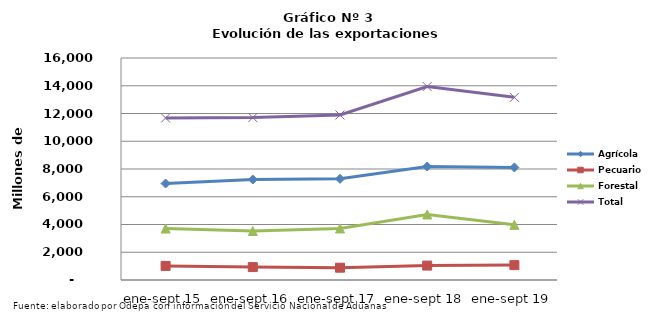
| Category | Agrícola | Pecuario | Forestal | Total |
|---|---|---|---|---|
| ene-sept 15 | 6952954 | 1013702 | 3706848 | 11673504 |
| ene-sept 16 | 7242655 | 930928 | 3530666 | 11704249 |
| ene-sept 17 | 7291030 | 887030 | 3715359 | 11893419 |
| ene-sept 18 | 8179024 | 1039924 | 4724575 | 13943523 |
| ene-sept 19 | 8113921 | 1072449 | 3977101 | 13163471 |